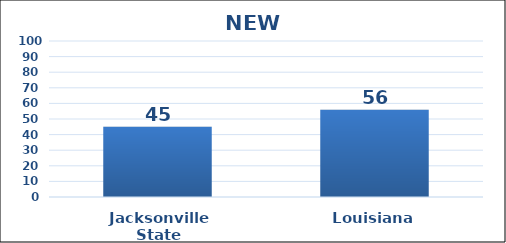
| Category | Series 0 |
|---|---|
| Jacksonville State | 45 |
| Louisiana | 56 |